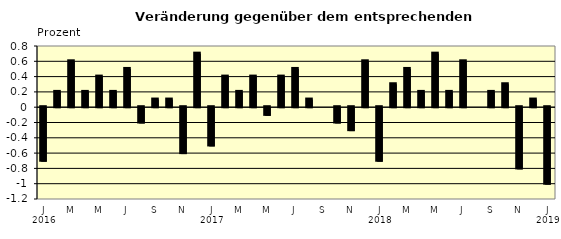
| Category | Series 0 |
|---|---|
| 0 | -0.7 |
| 1 | 0.2 |
| 2 | 0.6 |
| 3 | 0.2 |
| 4 | 0.4 |
| 5 | 0.2 |
| 6 | 0.5 |
| 7 | -0.2 |
| 8 | 0.1 |
| 9 | 0.1 |
| 10 | -0.6 |
| 11 | 0.7 |
| 12 | -0.5 |
| 13 | 0.4 |
| 14 | 0.2 |
| 15 | 0.4 |
| 16 | -0.1 |
| 17 | 0.4 |
| 18 | 0.5 |
| 19 | 0.1 |
| 20 | 0 |
| 21 | -0.2 |
| 22 | -0.3 |
| 23 | 0.6 |
| 24 | -0.7 |
| 25 | 0.3 |
| 26 | 0.5 |
| 27 | 0.2 |
| 28 | 0.7 |
| 29 | 0.2 |
| 30 | 0.6 |
| 31 | 0 |
| 32 | 0.2 |
| 33 | 0.3 |
| 34 | -0.8 |
| 35 | 0.1 |
| 36 | -1 |